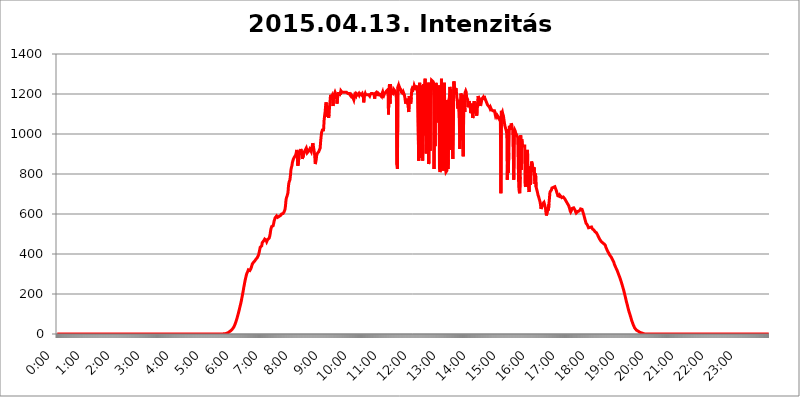
| Category | 2015.04.13. Intenzitás [W/m^2] |
|---|---|
| 0.0 | -0.256 |
| 0.0006944444444444445 | -0.256 |
| 0.001388888888888889 | -0.256 |
| 0.0020833333333333333 | -0.256 |
| 0.002777777777777778 | -0.256 |
| 0.003472222222222222 | -0.256 |
| 0.004166666666666667 | -0.256 |
| 0.004861111111111111 | -0.256 |
| 0.005555555555555556 | -0.256 |
| 0.0062499999999999995 | -0.256 |
| 0.006944444444444444 | -0.256 |
| 0.007638888888888889 | -0.256 |
| 0.008333333333333333 | -0.256 |
| 0.009027777777777779 | -0.256 |
| 0.009722222222222222 | -0.256 |
| 0.010416666666666666 | -0.256 |
| 0.011111111111111112 | -0.256 |
| 0.011805555555555555 | -0.256 |
| 0.012499999999999999 | -0.256 |
| 0.013194444444444444 | -0.256 |
| 0.013888888888888888 | -0.256 |
| 0.014583333333333332 | -0.256 |
| 0.015277777777777777 | -0.256 |
| 0.015972222222222224 | -0.256 |
| 0.016666666666666666 | -0.256 |
| 0.017361111111111112 | -0.256 |
| 0.018055555555555557 | -0.256 |
| 0.01875 | -0.256 |
| 0.019444444444444445 | -0.256 |
| 0.02013888888888889 | -0.256 |
| 0.020833333333333332 | -0.256 |
| 0.02152777777777778 | -0.256 |
| 0.022222222222222223 | -0.256 |
| 0.02291666666666667 | -0.256 |
| 0.02361111111111111 | -0.256 |
| 0.024305555555555556 | -0.256 |
| 0.024999999999999998 | -0.256 |
| 0.025694444444444447 | -0.256 |
| 0.02638888888888889 | -0.256 |
| 0.027083333333333334 | -0.256 |
| 0.027777777777777776 | -0.256 |
| 0.02847222222222222 | -0.256 |
| 0.029166666666666664 | -0.256 |
| 0.029861111111111113 | -0.256 |
| 0.030555555555555555 | -0.256 |
| 0.03125 | -0.256 |
| 0.03194444444444445 | -0.256 |
| 0.03263888888888889 | -0.256 |
| 0.03333333333333333 | -0.256 |
| 0.034027777777777775 | -0.256 |
| 0.034722222222222224 | -0.256 |
| 0.035416666666666666 | -0.256 |
| 0.036111111111111115 | -0.256 |
| 0.03680555555555556 | -0.256 |
| 0.0375 | -0.256 |
| 0.03819444444444444 | -0.256 |
| 0.03888888888888889 | -0.256 |
| 0.03958333333333333 | -0.256 |
| 0.04027777777777778 | -0.256 |
| 0.04097222222222222 | -0.256 |
| 0.041666666666666664 | -0.256 |
| 0.042361111111111106 | -0.256 |
| 0.04305555555555556 | -0.256 |
| 0.043750000000000004 | -0.256 |
| 0.044444444444444446 | -0.256 |
| 0.04513888888888889 | -0.256 |
| 0.04583333333333334 | -0.256 |
| 0.04652777777777778 | -0.256 |
| 0.04722222222222222 | -0.256 |
| 0.04791666666666666 | -0.256 |
| 0.04861111111111111 | -0.256 |
| 0.049305555555555554 | -0.256 |
| 0.049999999999999996 | -0.256 |
| 0.05069444444444445 | -0.256 |
| 0.051388888888888894 | -0.256 |
| 0.052083333333333336 | -0.256 |
| 0.05277777777777778 | -0.256 |
| 0.05347222222222222 | -0.256 |
| 0.05416666666666667 | -0.256 |
| 0.05486111111111111 | -0.256 |
| 0.05555555555555555 | -0.256 |
| 0.05625 | -0.256 |
| 0.05694444444444444 | -0.256 |
| 0.057638888888888885 | -0.256 |
| 0.05833333333333333 | -0.256 |
| 0.05902777777777778 | -0.256 |
| 0.059722222222222225 | -0.256 |
| 0.06041666666666667 | -0.256 |
| 0.061111111111111116 | -0.256 |
| 0.06180555555555556 | -0.256 |
| 0.0625 | -0.256 |
| 0.06319444444444444 | -0.256 |
| 0.06388888888888888 | -0.256 |
| 0.06458333333333334 | -0.256 |
| 0.06527777777777778 | -0.256 |
| 0.06597222222222222 | -0.256 |
| 0.06666666666666667 | -0.256 |
| 0.06736111111111111 | -0.256 |
| 0.06805555555555555 | -0.256 |
| 0.06874999999999999 | -0.256 |
| 0.06944444444444443 | -0.256 |
| 0.07013888888888889 | -0.256 |
| 0.07083333333333333 | -0.256 |
| 0.07152777777777779 | -0.256 |
| 0.07222222222222223 | -0.256 |
| 0.07291666666666667 | -0.256 |
| 0.07361111111111111 | -0.256 |
| 0.07430555555555556 | -0.256 |
| 0.075 | -0.256 |
| 0.07569444444444444 | -0.256 |
| 0.0763888888888889 | -0.256 |
| 0.07708333333333334 | -0.256 |
| 0.07777777777777778 | -0.256 |
| 0.07847222222222222 | -0.256 |
| 0.07916666666666666 | -0.256 |
| 0.0798611111111111 | -0.256 |
| 0.08055555555555556 | -0.256 |
| 0.08125 | -0.256 |
| 0.08194444444444444 | -0.256 |
| 0.08263888888888889 | -0.256 |
| 0.08333333333333333 | -0.256 |
| 0.08402777777777777 | -0.256 |
| 0.08472222222222221 | -0.256 |
| 0.08541666666666665 | -0.256 |
| 0.08611111111111112 | -0.256 |
| 0.08680555555555557 | -0.256 |
| 0.08750000000000001 | -0.256 |
| 0.08819444444444445 | -0.256 |
| 0.08888888888888889 | -0.256 |
| 0.08958333333333333 | -0.256 |
| 0.09027777777777778 | -0.256 |
| 0.09097222222222222 | -0.256 |
| 0.09166666666666667 | -0.256 |
| 0.09236111111111112 | -0.256 |
| 0.09305555555555556 | -0.256 |
| 0.09375 | -0.256 |
| 0.09444444444444444 | -0.256 |
| 0.09513888888888888 | -0.256 |
| 0.09583333333333333 | -0.256 |
| 0.09652777777777777 | -0.256 |
| 0.09722222222222222 | -0.256 |
| 0.09791666666666667 | -0.256 |
| 0.09861111111111111 | -0.256 |
| 0.09930555555555555 | -0.256 |
| 0.09999999999999999 | -0.256 |
| 0.10069444444444443 | -0.256 |
| 0.1013888888888889 | -0.256 |
| 0.10208333333333335 | -0.256 |
| 0.10277777777777779 | -0.256 |
| 0.10347222222222223 | -0.256 |
| 0.10416666666666667 | -0.256 |
| 0.10486111111111111 | -0.256 |
| 0.10555555555555556 | -0.256 |
| 0.10625 | -0.256 |
| 0.10694444444444444 | -0.256 |
| 0.1076388888888889 | -0.256 |
| 0.10833333333333334 | -0.256 |
| 0.10902777777777778 | -0.256 |
| 0.10972222222222222 | -0.256 |
| 0.1111111111111111 | -0.256 |
| 0.11180555555555556 | -0.256 |
| 0.11180555555555556 | -0.256 |
| 0.1125 | -0.256 |
| 0.11319444444444444 | -0.256 |
| 0.11388888888888889 | -0.256 |
| 0.11458333333333333 | -0.256 |
| 0.11527777777777777 | -0.256 |
| 0.11597222222222221 | -0.256 |
| 0.11666666666666665 | -0.256 |
| 0.1173611111111111 | -0.256 |
| 0.11805555555555557 | -0.256 |
| 0.11944444444444445 | -0.256 |
| 0.12013888888888889 | -0.256 |
| 0.12083333333333333 | -0.256 |
| 0.12152777777777778 | -0.256 |
| 0.12222222222222223 | -0.256 |
| 0.12291666666666667 | -0.256 |
| 0.12291666666666667 | -0.256 |
| 0.12361111111111112 | -0.256 |
| 0.12430555555555556 | -0.256 |
| 0.125 | -0.256 |
| 0.12569444444444444 | -0.256 |
| 0.12638888888888888 | -0.256 |
| 0.12708333333333333 | -0.256 |
| 0.16875 | -0.256 |
| 0.12847222222222224 | -0.256 |
| 0.12916666666666668 | -0.256 |
| 0.12986111111111112 | -0.256 |
| 0.13055555555555556 | -0.256 |
| 0.13125 | -0.256 |
| 0.13194444444444445 | -0.256 |
| 0.1326388888888889 | -0.256 |
| 0.13333333333333333 | -0.256 |
| 0.13402777777777777 | -0.256 |
| 0.13402777777777777 | -0.256 |
| 0.13472222222222222 | -0.256 |
| 0.13541666666666666 | -0.256 |
| 0.1361111111111111 | -0.256 |
| 0.13749999999999998 | -0.256 |
| 0.13819444444444443 | -0.256 |
| 0.1388888888888889 | -0.256 |
| 0.13958333333333334 | -0.256 |
| 0.14027777777777778 | -0.256 |
| 0.14097222222222222 | -0.256 |
| 0.14166666666666666 | -0.256 |
| 0.1423611111111111 | -0.256 |
| 0.14305555555555557 | -0.256 |
| 0.14375000000000002 | -0.256 |
| 0.14444444444444446 | -0.256 |
| 0.1451388888888889 | -0.256 |
| 0.1451388888888889 | -0.256 |
| 0.14652777777777778 | -0.256 |
| 0.14722222222222223 | -0.256 |
| 0.14791666666666667 | -0.256 |
| 0.1486111111111111 | -0.256 |
| 0.14930555555555555 | -0.256 |
| 0.15 | -0.256 |
| 0.15069444444444444 | -0.256 |
| 0.15138888888888888 | -0.256 |
| 0.15208333333333332 | -0.256 |
| 0.15277777777777776 | -0.256 |
| 0.15347222222222223 | -0.256 |
| 0.15416666666666667 | -0.256 |
| 0.15486111111111112 | -0.256 |
| 0.15555555555555556 | -0.256 |
| 0.15625 | -0.256 |
| 0.15694444444444444 | -0.256 |
| 0.15763888888888888 | -0.256 |
| 0.15833333333333333 | -0.256 |
| 0.15902777777777777 | -0.256 |
| 0.15972222222222224 | -0.256 |
| 0.16041666666666668 | -0.256 |
| 0.16111111111111112 | -0.256 |
| 0.16180555555555556 | -0.256 |
| 0.1625 | -0.256 |
| 0.16319444444444445 | -0.256 |
| 0.1638888888888889 | -0.256 |
| 0.16458333333333333 | -0.256 |
| 0.16527777777777777 | -0.256 |
| 0.16597222222222222 | -0.256 |
| 0.16666666666666666 | -0.256 |
| 0.1673611111111111 | -0.256 |
| 0.16805555555555554 | -0.256 |
| 0.16874999999999998 | -0.256 |
| 0.16944444444444443 | -0.256 |
| 0.17013888888888887 | -0.256 |
| 0.1708333333333333 | -0.256 |
| 0.17152777777777775 | -0.256 |
| 0.17222222222222225 | -0.256 |
| 0.1729166666666667 | -0.256 |
| 0.17361111111111113 | -0.256 |
| 0.17430555555555557 | -0.256 |
| 0.17500000000000002 | -0.256 |
| 0.17569444444444446 | -0.256 |
| 0.1763888888888889 | -0.256 |
| 0.17708333333333334 | -0.256 |
| 0.17777777777777778 | -0.256 |
| 0.17847222222222223 | -0.256 |
| 0.17916666666666667 | -0.256 |
| 0.1798611111111111 | -0.256 |
| 0.18055555555555555 | -0.256 |
| 0.18125 | -0.256 |
| 0.18194444444444444 | -0.256 |
| 0.1826388888888889 | -0.256 |
| 0.18333333333333335 | -0.256 |
| 0.1840277777777778 | -0.256 |
| 0.18472222222222223 | -0.256 |
| 0.18541666666666667 | -0.256 |
| 0.18611111111111112 | -0.256 |
| 0.18680555555555556 | -0.256 |
| 0.1875 | -0.256 |
| 0.18819444444444444 | -0.256 |
| 0.18888888888888888 | -0.256 |
| 0.18958333333333333 | -0.256 |
| 0.19027777777777777 | -0.256 |
| 0.1909722222222222 | -0.256 |
| 0.19166666666666665 | -0.256 |
| 0.19236111111111112 | -0.256 |
| 0.19305555555555554 | -0.256 |
| 0.19375 | -0.256 |
| 0.19444444444444445 | -0.256 |
| 0.1951388888888889 | -0.256 |
| 0.19583333333333333 | -0.256 |
| 0.19652777777777777 | -0.256 |
| 0.19722222222222222 | -0.256 |
| 0.19791666666666666 | -0.256 |
| 0.1986111111111111 | -0.256 |
| 0.19930555555555554 | -0.256 |
| 0.19999999999999998 | -0.256 |
| 0.20069444444444443 | -0.256 |
| 0.20138888888888887 | -0.256 |
| 0.2020833333333333 | -0.256 |
| 0.2027777777777778 | -0.256 |
| 0.2034722222222222 | -0.256 |
| 0.2041666666666667 | -0.256 |
| 0.20486111111111113 | -0.256 |
| 0.20555555555555557 | -0.256 |
| 0.20625000000000002 | -0.256 |
| 0.20694444444444446 | -0.256 |
| 0.2076388888888889 | -0.256 |
| 0.20833333333333334 | -0.256 |
| 0.20902777777777778 | -0.256 |
| 0.20972222222222223 | -0.256 |
| 0.21041666666666667 | -0.256 |
| 0.2111111111111111 | -0.256 |
| 0.21180555555555555 | -0.256 |
| 0.2125 | -0.256 |
| 0.21319444444444444 | -0.256 |
| 0.2138888888888889 | -0.256 |
| 0.21458333333333335 | -0.256 |
| 0.2152777777777778 | -0.256 |
| 0.21597222222222223 | -0.256 |
| 0.21666666666666667 | -0.256 |
| 0.21736111111111112 | -0.256 |
| 0.21805555555555556 | -0.256 |
| 0.21875 | -0.256 |
| 0.21944444444444444 | -0.256 |
| 0.22013888888888888 | -0.256 |
| 0.22083333333333333 | -0.256 |
| 0.22152777777777777 | -0.256 |
| 0.2222222222222222 | -0.256 |
| 0.22291666666666665 | -0.256 |
| 0.2236111111111111 | -0.256 |
| 0.22430555555555556 | -0.256 |
| 0.225 | -0.256 |
| 0.22569444444444445 | -0.256 |
| 0.2263888888888889 | -0.256 |
| 0.22708333333333333 | -0.256 |
| 0.22777777777777777 | -0.256 |
| 0.22847222222222222 | -0.256 |
| 0.22916666666666666 | -0.256 |
| 0.2298611111111111 | -0.256 |
| 0.23055555555555554 | -0.256 |
| 0.23124999999999998 | -0.256 |
| 0.23194444444444443 | -0.256 |
| 0.23263888888888887 | -0.256 |
| 0.2333333333333333 | 1.09 |
| 0.2340277777777778 | 1.09 |
| 0.2347222222222222 | 1.09 |
| 0.2354166666666667 | 1.09 |
| 0.23611111111111113 | 2.439 |
| 0.23680555555555557 | 3.791 |
| 0.23750000000000002 | 3.791 |
| 0.23819444444444446 | 5.146 |
| 0.2388888888888889 | 6.503 |
| 0.23958333333333334 | 6.503 |
| 0.24027777777777778 | 9.225 |
| 0.24097222222222223 | 9.225 |
| 0.24166666666666667 | 11.956 |
| 0.2423611111111111 | 13.325 |
| 0.24305555555555555 | 14.696 |
| 0.24375 | 17.444 |
| 0.24444444444444446 | 20.201 |
| 0.24513888888888888 | 22.965 |
| 0.24583333333333335 | 25.736 |
| 0.2465277777777778 | 28.514 |
| 0.24722222222222223 | 32.691 |
| 0.24791666666666667 | 36.881 |
| 0.24861111111111112 | 42.483 |
| 0.24930555555555556 | 48.1 |
| 0.25 | 55.139 |
| 0.25069444444444444 | 62.189 |
| 0.2513888888888889 | 70.658 |
| 0.2520833333333333 | 77.715 |
| 0.25277777777777777 | 87.583 |
| 0.2534722222222222 | 96.022 |
| 0.25416666666666665 | 105.834 |
| 0.2548611111111111 | 115.598 |
| 0.2555555555555556 | 125.304 |
| 0.25625000000000003 | 136.314 |
| 0.2569444444444445 | 145.865 |
| 0.2576388888888889 | 156.678 |
| 0.25833333333333336 | 168.703 |
| 0.2590277777777778 | 181.877 |
| 0.25972222222222224 | 194.849 |
| 0.2604166666666667 | 207.615 |
| 0.2611111111111111 | 221.422 |
| 0.26180555555555557 | 236.212 |
| 0.2625 | 249.538 |
| 0.26319444444444445 | 262.666 |
| 0.2638888888888889 | 274.454 |
| 0.26458333333333334 | 284.967 |
| 0.2652777777777778 | 295.413 |
| 0.2659722222222222 | 303.509 |
| 0.26666666666666666 | 308.129 |
| 0.2673611111111111 | 313.904 |
| 0.26805555555555555 | 320.84 |
| 0.26875 | 320.84 |
| 0.26944444444444443 | 316.215 |
| 0.2701388888888889 | 317.371 |
| 0.2708333333333333 | 321.998 |
| 0.27152777777777776 | 326.633 |
| 0.2722222222222222 | 333.608 |
| 0.27291666666666664 | 341.794 |
| 0.2736111111111111 | 350.049 |
| 0.2743055555555555 | 354.805 |
| 0.27499999999999997 | 357.196 |
| 0.27569444444444446 | 358.394 |
| 0.27638888888888885 | 362.004 |
| 0.27708333333333335 | 365.635 |
| 0.2777777777777778 | 369.291 |
| 0.27847222222222223 | 372.972 |
| 0.2791666666666667 | 374.206 |
| 0.2798611111111111 | 376.682 |
| 0.28055555555555556 | 381.674 |
| 0.28125 | 386.723 |
| 0.28194444444444444 | 391.834 |
| 0.2826388888888889 | 399.628 |
| 0.2833333333333333 | 410.283 |
| 0.28402777777777777 | 422.678 |
| 0.2847222222222222 | 434.107 |
| 0.28541666666666665 | 434.107 |
| 0.28611111111111115 | 431.211 |
| 0.28680555555555554 | 441.469 |
| 0.28750000000000003 | 456.747 |
| 0.2881944444444445 | 456.747 |
| 0.2888888888888889 | 461.486 |
| 0.28958333333333336 | 466.302 |
| 0.2902777777777778 | 471.198 |
| 0.29097222222222224 | 474.507 |
| 0.2916666666666667 | 476.176 |
| 0.2923611111111111 | 476.176 |
| 0.29305555555555557 | 467.925 |
| 0.29375 | 461.486 |
| 0.29444444444444445 | 463.083 |
| 0.2951388888888889 | 472.848 |
| 0.29583333333333334 | 471.198 |
| 0.2965277777777778 | 474.507 |
| 0.2972222222222222 | 479.541 |
| 0.29791666666666666 | 488.126 |
| 0.2986111111111111 | 500.575 |
| 0.29930555555555555 | 517.375 |
| 0.3 | 529.108 |
| 0.30069444444444443 | 537.182 |
| 0.3013888888888889 | 539.234 |
| 0.3020833333333333 | 537.182 |
| 0.30277777777777776 | 541.298 |
| 0.3034722222222222 | 551.823 |
| 0.30416666666666664 | 564.917 |
| 0.3048611111111111 | 571.661 |
| 0.3055555555555555 | 580.866 |
| 0.30624999999999997 | 585.562 |
| 0.3069444444444444 | 585.562 |
| 0.3076388888888889 | 590.321 |
| 0.30833333333333335 | 585.562 |
| 0.3090277777777778 | 583.206 |
| 0.30972222222222223 | 583.206 |
| 0.3104166666666667 | 585.562 |
| 0.3111111111111111 | 587.934 |
| 0.31180555555555556 | 587.934 |
| 0.3125 | 587.934 |
| 0.31319444444444444 | 592.725 |
| 0.3138888888888889 | 597.582 |
| 0.3145833333333333 | 600.035 |
| 0.31527777777777777 | 597.582 |
| 0.3159722222222222 | 600.035 |
| 0.31666666666666665 | 602.505 |
| 0.31736111111111115 | 604.992 |
| 0.31805555555555554 | 610.016 |
| 0.31875000000000003 | 612.554 |
| 0.3194444444444445 | 622.881 |
| 0.3201388888888889 | 641.649 |
| 0.32083333333333336 | 670.078 |
| 0.3215277777777778 | 682.011 |
| 0.32222222222222224 | 688.102 |
| 0.3229166666666667 | 685.046 |
| 0.3236111111111111 | 706.89 |
| 0.32430555555555557 | 739.988 |
| 0.325 | 757.414 |
| 0.32569444444444445 | 764.555 |
| 0.3263888888888889 | 771.794 |
| 0.32708333333333334 | 794.119 |
| 0.3277777777777778 | 821.353 |
| 0.3284722222222222 | 833.43 |
| 0.32916666666666666 | 841.619 |
| 0.3298611111111111 | 858.335 |
| 0.33055555555555555 | 866.865 |
| 0.33125 | 875.511 |
| 0.33194444444444443 | 871.173 |
| 0.3326388888888889 | 879.878 |
| 0.3333333333333333 | 888.701 |
| 0.3340277777777778 | 888.701 |
| 0.3347222222222222 | 897.643 |
| 0.3354166666666667 | 911.285 |
| 0.3361111111111111 | 920.533 |
| 0.3368055555555556 | 915.893 |
| 0.33749999999999997 | 841.619 |
| 0.33819444444444446 | 845.755 |
| 0.33888888888888885 | 879.878 |
| 0.33958333333333335 | 915.893 |
| 0.34027777777777773 | 897.643 |
| 0.34097222222222223 | 906.707 |
| 0.3416666666666666 | 925.203 |
| 0.3423611111111111 | 911.285 |
| 0.3430555555555555 | 911.285 |
| 0.34375 | 875.511 |
| 0.3444444444444445 | 875.511 |
| 0.3451388888888889 | 893.157 |
| 0.3458333333333334 | 915.893 |
| 0.34652777777777777 | 906.707 |
| 0.34722222222222227 | 906.707 |
| 0.34791666666666665 | 920.533 |
| 0.34861111111111115 | 915.893 |
| 0.34930555555555554 | 929.905 |
| 0.35000000000000003 | 920.533 |
| 0.3506944444444444 | 906.707 |
| 0.3513888888888889 | 911.285 |
| 0.3520833333333333 | 906.707 |
| 0.3527777777777778 | 915.893 |
| 0.3534722222222222 | 915.893 |
| 0.3541666666666667 | 925.203 |
| 0.3548611111111111 | 920.533 |
| 0.35555555555555557 | 925.203 |
| 0.35625 | 911.285 |
| 0.35694444444444445 | 915.893 |
| 0.3576388888888889 | 939.404 |
| 0.35833333333333334 | 953.892 |
| 0.3590277777777778 | 944.201 |
| 0.3597222222222222 | 939.404 |
| 0.36041666666666666 | 911.285 |
| 0.3611111111111111 | 893.157 |
| 0.36180555555555555 | 849.92 |
| 0.3625 | 858.335 |
| 0.36319444444444443 | 871.173 |
| 0.3638888888888889 | 893.157 |
| 0.3645833333333333 | 902.16 |
| 0.3652777777777778 | 906.707 |
| 0.3659722222222222 | 902.16 |
| 0.3666666666666667 | 911.285 |
| 0.3673611111111111 | 911.285 |
| 0.3680555555555556 | 915.893 |
| 0.36874999999999997 | 929.905 |
| 0.36944444444444446 | 963.712 |
| 0.37013888888888885 | 988.839 |
| 0.37083333333333335 | 1009.546 |
| 0.37152777777777773 | 1014.809 |
| 0.37222222222222223 | 1025.437 |
| 0.3729166666666666 | 1014.809 |
| 0.3736111111111111 | 1025.437 |
| 0.3743055555555555 | 1069.368 |
| 0.375 | 1092.203 |
| 0.3756944444444445 | 1109.72 |
| 0.3763888888888889 | 1139.675 |
| 0.3770833333333334 | 1158.113 |
| 0.37777777777777777 | 1133.607 |
| 0.37847222222222227 | 1127.578 |
| 0.37916666666666665 | 1086.439 |
| 0.37986111111111115 | 1115.634 |
| 0.38055555555555554 | 1080.711 |
| 0.38125000000000003 | 1098.004 |
| 0.3819444444444444 | 1139.675 |
| 0.3826388888888889 | 1164.337 |
| 0.3833333333333333 | 1196.058 |
| 0.3840277777777778 | 1176.905 |
| 0.3847222222222222 | 1183.249 |
| 0.3854166666666667 | 1189.633 |
| 0.3861111111111111 | 1176.905 |
| 0.38680555555555557 | 1139.675 |
| 0.3875 | 1183.249 |
| 0.38819444444444445 | 1196.058 |
| 0.3888888888888889 | 1196.058 |
| 0.38958333333333334 | 1209.029 |
| 0.3902777777777778 | 1202.523 |
| 0.3909722222222222 | 1196.058 |
| 0.39166666666666666 | 1183.249 |
| 0.3923611111111111 | 1151.928 |
| 0.39305555555555555 | 1176.905 |
| 0.39375 | 1196.058 |
| 0.39444444444444443 | 1209.029 |
| 0.3951388888888889 | 1209.029 |
| 0.3958333333333333 | 1189.633 |
| 0.3965277777777778 | 1209.029 |
| 0.3972222222222222 | 1196.058 |
| 0.3979166666666667 | 1215.576 |
| 0.3986111111111111 | 1215.576 |
| 0.3993055555555556 | 1209.029 |
| 0.39999999999999997 | 1209.029 |
| 0.40069444444444446 | 1209.029 |
| 0.40138888888888885 | 1209.029 |
| 0.40208333333333335 | 1209.029 |
| 0.40277777777777773 | 1209.029 |
| 0.40347222222222223 | 1209.029 |
| 0.4041666666666666 | 1209.029 |
| 0.4048611111111111 | 1209.029 |
| 0.4055555555555555 | 1209.029 |
| 0.40625 | 1209.029 |
| 0.4069444444444445 | 1209.029 |
| 0.4076388888888889 | 1202.523 |
| 0.4083333333333334 | 1202.523 |
| 0.40902777777777777 | 1202.523 |
| 0.40972222222222227 | 1202.523 |
| 0.41041666666666665 | 1196.058 |
| 0.41111111111111115 | 1196.058 |
| 0.41180555555555554 | 1189.633 |
| 0.41250000000000003 | 1196.058 |
| 0.4131944444444444 | 1196.058 |
| 0.4138888888888889 | 1189.633 |
| 0.4145833333333333 | 1183.249 |
| 0.4152777777777778 | 1176.905 |
| 0.4159722222222222 | 1170.601 |
| 0.4166666666666667 | 1183.249 |
| 0.4173611111111111 | 1196.058 |
| 0.41805555555555557 | 1196.058 |
| 0.41875 | 1189.633 |
| 0.41944444444444445 | 1202.523 |
| 0.4201388888888889 | 1202.523 |
| 0.42083333333333334 | 1202.523 |
| 0.4215277777777778 | 1196.058 |
| 0.4222222222222222 | 1196.058 |
| 0.42291666666666666 | 1202.523 |
| 0.4236111111111111 | 1196.058 |
| 0.42430555555555555 | 1202.523 |
| 0.425 | 1202.523 |
| 0.42569444444444443 | 1202.523 |
| 0.4263888888888889 | 1196.058 |
| 0.4270833333333333 | 1196.058 |
| 0.4277777777777778 | 1202.523 |
| 0.4284722222222222 | 1196.058 |
| 0.4291666666666667 | 1189.633 |
| 0.4298611111111111 | 1158.113 |
| 0.4305555555555556 | 1189.633 |
| 0.43124999999999997 | 1196.058 |
| 0.43194444444444446 | 1202.523 |
| 0.43263888888888885 | 1196.058 |
| 0.43333333333333335 | 1196.058 |
| 0.43402777777777773 | 1196.058 |
| 0.43472222222222223 | 1196.058 |
| 0.4354166666666666 | 1196.058 |
| 0.4361111111111111 | 1196.058 |
| 0.4368055555555555 | 1196.058 |
| 0.4375 | 1196.058 |
| 0.4381944444444445 | 1189.633 |
| 0.4388888888888889 | 1196.058 |
| 0.4395833333333334 | 1196.058 |
| 0.44027777777777777 | 1202.523 |
| 0.44097222222222227 | 1202.523 |
| 0.44166666666666665 | 1202.523 |
| 0.44236111111111115 | 1202.523 |
| 0.44305555555555554 | 1202.523 |
| 0.44375000000000003 | 1202.523 |
| 0.4444444444444444 | 1196.058 |
| 0.4451388888888889 | 1176.905 |
| 0.4458333333333333 | 1202.523 |
| 0.4465277777777778 | 1202.523 |
| 0.4472222222222222 | 1202.523 |
| 0.4479166666666667 | 1209.029 |
| 0.4486111111111111 | 1209.029 |
| 0.44930555555555557 | 1202.523 |
| 0.45 | 1189.633 |
| 0.45069444444444445 | 1202.523 |
| 0.4513888888888889 | 1202.523 |
| 0.45208333333333334 | 1202.523 |
| 0.4527777777777778 | 1196.058 |
| 0.4534722222222222 | 1196.058 |
| 0.45416666666666666 | 1189.633 |
| 0.4548611111111111 | 1196.058 |
| 0.45555555555555555 | 1202.523 |
| 0.45625 | 1209.029 |
| 0.45694444444444443 | 1196.058 |
| 0.4576388888888889 | 1202.523 |
| 0.4583333333333333 | 1196.058 |
| 0.4590277777777778 | 1202.523 |
| 0.4597222222222222 | 1202.523 |
| 0.4604166666666667 | 1202.523 |
| 0.4611111111111111 | 1209.029 |
| 0.4618055555555556 | 1215.576 |
| 0.46249999999999997 | 1215.576 |
| 0.46319444444444446 | 1215.576 |
| 0.46388888888888885 | 1222.164 |
| 0.46458333333333335 | 1098.004 |
| 0.46527777777777773 | 1222.164 |
| 0.46597222222222223 | 1248.934 |
| 0.4666666666666666 | 1151.928 |
| 0.4673611111111111 | 1248.934 |
| 0.4680555555555555 | 1222.164 |
| 0.46875 | 1209.029 |
| 0.4694444444444445 | 1209.029 |
| 0.4701388888888889 | 1209.029 |
| 0.4708333333333334 | 1202.523 |
| 0.47152777777777777 | 1209.029 |
| 0.47222222222222227 | 1222.164 |
| 0.47291666666666665 | 1222.164 |
| 0.47361111111111115 | 1215.576 |
| 0.47430555555555554 | 1209.029 |
| 0.47500000000000003 | 1196.058 |
| 0.4756944444444444 | 1202.523 |
| 0.4763888888888889 | 845.755 |
| 0.4770833333333333 | 825.351 |
| 0.4777777777777778 | 1235.465 |
| 0.4784722222222222 | 1242.179 |
| 0.4791666666666667 | 1228.794 |
| 0.4798611111111111 | 1235.465 |
| 0.48055555555555557 | 1228.794 |
| 0.48125 | 1228.794 |
| 0.48194444444444445 | 1222.164 |
| 0.4826388888888889 | 1209.029 |
| 0.48333333333333334 | 1209.029 |
| 0.4840277777777778 | 1209.029 |
| 0.4847222222222222 | 1202.523 |
| 0.48541666666666666 | 1209.029 |
| 0.4861111111111111 | 1202.523 |
| 0.48680555555555555 | 1196.058 |
| 0.4875 | 1183.249 |
| 0.48819444444444443 | 1164.337 |
| 0.4888888888888889 | 1151.928 |
| 0.4895833333333333 | 1170.601 |
| 0.4902777777777778 | 1164.337 |
| 0.4909722222222222 | 1170.601 |
| 0.4916666666666667 | 1176.905 |
| 0.4923611111111111 | 1133.607 |
| 0.4930555555555556 | 1109.72 |
| 0.49374999999999997 | 1189.633 |
| 0.49444444444444446 | 1176.905 |
| 0.49513888888888885 | 1164.337 |
| 0.49583333333333335 | 1151.928 |
| 0.49652777777777773 | 1183.249 |
| 0.49722222222222223 | 1222.164 |
| 0.4979166666666666 | 1228.794 |
| 0.4986111111111111 | 1228.794 |
| 0.4993055555555555 | 1222.164 |
| 0.5 | 1228.794 |
| 0.5006944444444444 | 1242.179 |
| 0.5013888888888889 | 1235.465 |
| 0.5020833333333333 | 1235.465 |
| 0.5027777777777778 | 1222.164 |
| 0.5034722222222222 | 1242.179 |
| 0.5041666666666667 | 1222.164 |
| 0.5048611111111111 | 1215.576 |
| 0.5055555555555555 | 1222.164 |
| 0.50625 | 1222.164 |
| 0.5069444444444444 | 866.865 |
| 0.5076388888888889 | 988.839 |
| 0.5083333333333333 | 1255.731 |
| 0.5090277777777777 | 879.878 |
| 0.5097222222222222 | 963.712 |
| 0.5104166666666666 | 1242.179 |
| 0.5111111111111112 | 1228.794 |
| 0.5118055555555555 | 1189.633 |
| 0.5125000000000001 | 866.865 |
| 0.5131944444444444 | 866.865 |
| 0.513888888888889 | 1248.934 |
| 0.5145833333333333 | 993.965 |
| 0.5152777777777778 | 1248.934 |
| 0.5159722222222222 | 1276.38 |
| 0.5166666666666667 | 1196.058 |
| 0.517361111111111 | 902.16 |
| 0.5180555555555556 | 988.839 |
| 0.5187499999999999 | 1222.164 |
| 0.5194444444444445 | 1248.934 |
| 0.5201388888888888 | 1255.731 |
| 0.5208333333333334 | 849.92 |
| 0.5215277777777778 | 862.585 |
| 0.5222222222222223 | 1255.731 |
| 0.5229166666666667 | 915.893 |
| 0.5236111111111111 | 1222.164 |
| 0.5243055555555556 | 1235.465 |
| 0.525 | 1269.454 |
| 0.5256944444444445 | 1269.454 |
| 0.5263888888888889 | 1269.454 |
| 0.5270833333333333 | 1262.571 |
| 0.5277777777777778 | 1255.731 |
| 0.5284722222222222 | 825.351 |
| 0.5291666666666667 | 1222.164 |
| 0.5298611111111111 | 939.404 |
| 0.5305555555555556 | 1222.164 |
| 0.53125 | 1255.731 |
| 0.5319444444444444 | 1235.465 |
| 0.5326388888888889 | 1196.058 |
| 0.5333333333333333 | 1235.465 |
| 0.5340277777777778 | 1058.17 |
| 0.5347222222222222 | 1242.179 |
| 0.5354166666666667 | 1196.058 |
| 0.5361111111111111 | 825.351 |
| 0.5368055555555555 | 809.522 |
| 0.5375 | 821.353 |
| 0.5381944444444444 | 1080.711 |
| 0.5388888888888889 | 1276.38 |
| 0.5395833333333333 | 1183.249 |
| 0.5402777777777777 | 1242.179 |
| 0.5409722222222222 | 817.382 |
| 0.5416666666666666 | 837.51 |
| 0.5423611111111112 | 1030.804 |
| 0.5430555555555555 | 1255.731 |
| 0.5437500000000001 | 879.878 |
| 0.5444444444444444 | 825.351 |
| 0.545138888888889 | 809.522 |
| 0.5458333333333333 | 805.632 |
| 0.5465277777777778 | 817.382 |
| 0.5472222222222222 | 1170.601 |
| 0.5479166666666667 | 825.351 |
| 0.548611111111111 | 871.173 |
| 0.5493055555555556 | 1170.601 |
| 0.5499999999999999 | 1183.249 |
| 0.5506944444444445 | 1235.465 |
| 0.5513888888888888 | 1209.029 |
| 0.5520833333333334 | 1222.164 |
| 0.5527777777777778 | 920.533 |
| 0.5534722222222223 | 1052.625 |
| 0.5541666666666667 | 939.404 |
| 0.5548611111111111 | 875.511 |
| 0.5555555555555556 | 875.511 |
| 0.55625 | 1262.571 |
| 0.5569444444444445 | 1242.179 |
| 0.5576388888888889 | 1228.794 |
| 0.5583333333333333 | 1215.576 |
| 0.5590277777777778 | 1228.794 |
| 0.5597222222222222 | 1215.576 |
| 0.5604166666666667 | 1183.249 |
| 0.5611111111111111 | 1170.601 |
| 0.5618055555555556 | 1127.578 |
| 0.5625 | 1164.337 |
| 0.5631944444444444 | 1170.601 |
| 0.5638888888888889 | 1080.711 |
| 0.5645833333333333 | 925.203 |
| 0.5652777777777778 | 1115.634 |
| 0.5659722222222222 | 1202.523 |
| 0.5666666666666667 | 1202.523 |
| 0.5673611111111111 | 1189.633 |
| 0.5680555555555555 | 968.671 |
| 0.56875 | 1151.928 |
| 0.5694444444444444 | 888.701 |
| 0.5701388888888889 | 1176.905 |
| 0.5708333333333333 | 1196.058 |
| 0.5715277777777777 | 1109.72 |
| 0.5722222222222222 | 1209.029 |
| 0.5729166666666666 | 1215.576 |
| 0.5736111111111112 | 1209.029 |
| 0.5743055555555555 | 1170.601 |
| 0.5750000000000001 | 1176.905 |
| 0.5756944444444444 | 1170.601 |
| 0.576388888888889 | 1133.607 |
| 0.5770833333333333 | 1133.607 |
| 0.5777777777777778 | 1164.337 |
| 0.5784722222222222 | 1164.337 |
| 0.5791666666666667 | 1139.675 |
| 0.579861111111111 | 1103.843 |
| 0.5805555555555556 | 1115.634 |
| 0.5812499999999999 | 1127.578 |
| 0.5819444444444445 | 1151.928 |
| 0.5826388888888888 | 1080.711 |
| 0.5833333333333334 | 1086.439 |
| 0.5840277777777778 | 1139.675 |
| 0.5847222222222223 | 1164.337 |
| 0.5854166666666667 | 1127.578 |
| 0.5861111111111111 | 1103.843 |
| 0.5868055555555556 | 1127.578 |
| 0.5875 | 1127.578 |
| 0.5881944444444445 | 1092.203 |
| 0.5888888888888889 | 1103.843 |
| 0.5895833333333333 | 1158.113 |
| 0.5902777777777778 | 1189.633 |
| 0.5909722222222222 | 1189.633 |
| 0.5916666666666667 | 1176.905 |
| 0.5923611111111111 | 1176.905 |
| 0.5930555555555556 | 1139.675 |
| 0.59375 | 1176.905 |
| 0.5944444444444444 | 1176.905 |
| 0.5951388888888889 | 1164.337 |
| 0.5958333333333333 | 1176.905 |
| 0.5965277777777778 | 1176.905 |
| 0.5972222222222222 | 1183.249 |
| 0.5979166666666667 | 1170.601 |
| 0.5986111111111111 | 1189.633 |
| 0.5993055555555555 | 1183.249 |
| 0.6 | 1176.905 |
| 0.6006944444444444 | 1170.601 |
| 0.6013888888888889 | 1164.337 |
| 0.6020833333333333 | 1164.337 |
| 0.6027777777777777 | 1151.928 |
| 0.6034722222222222 | 1145.782 |
| 0.6041666666666666 | 1145.782 |
| 0.6048611111111112 | 1139.675 |
| 0.6055555555555555 | 1139.675 |
| 0.6062500000000001 | 1133.607 |
| 0.6069444444444444 | 1127.578 |
| 0.607638888888889 | 1133.607 |
| 0.6083333333333333 | 1127.578 |
| 0.6090277777777778 | 1121.587 |
| 0.6097222222222222 | 1121.587 |
| 0.6104166666666667 | 1121.587 |
| 0.611111111111111 | 1115.634 |
| 0.6118055555555556 | 1115.634 |
| 0.6124999999999999 | 1115.634 |
| 0.6131944444444445 | 1115.634 |
| 0.6138888888888888 | 1103.843 |
| 0.6145833333333334 | 1092.203 |
| 0.6152777777777778 | 1098.004 |
| 0.6159722222222223 | 1098.004 |
| 0.6166666666666667 | 1086.439 |
| 0.6173611111111111 | 1092.203 |
| 0.6180555555555556 | 1092.203 |
| 0.61875 | 1092.203 |
| 0.6194444444444445 | 1080.711 |
| 0.6201388888888889 | 1075.021 |
| 0.6208333333333333 | 1086.439 |
| 0.6215277777777778 | 1063.751 |
| 0.6222222222222222 | 703.704 |
| 0.6229166666666667 | 1115.634 |
| 0.6236111111111111 | 1103.843 |
| 0.6243055555555556 | 1109.72 |
| 0.625 | 1098.004 |
| 0.6256944444444444 | 1092.203 |
| 0.6263888888888889 | 1075.021 |
| 0.6270833333333333 | 1058.17 |
| 0.6277777777777778 | 1041.644 |
| 0.6284722222222222 | 1041.644 |
| 0.6291666666666667 | 1041.644 |
| 0.6298611111111111 | 1014.809 |
| 0.6305555555555555 | 999.125 |
| 0.63125 | 771.794 |
| 0.6319444444444444 | 1025.437 |
| 0.6326388888888889 | 805.632 |
| 0.6333333333333333 | 906.707 |
| 0.6340277777777777 | 1041.644 |
| 0.6347222222222222 | 1036.206 |
| 0.6354166666666666 | 1025.437 |
| 0.6361111111111112 | 1020.106 |
| 0.6368055555555555 | 1052.625 |
| 0.6375000000000001 | 1047.117 |
| 0.6381944444444444 | 1025.437 |
| 0.638888888888889 | 1020.106 |
| 0.6395833333333333 | 902.16 |
| 0.6402777777777778 | 771.794 |
| 0.6409722222222222 | 1009.546 |
| 0.6416666666666667 | 1020.106 |
| 0.642361111111111 | 1014.809 |
| 0.6430555555555556 | 1004.318 |
| 0.6437499999999999 | 999.125 |
| 0.6444444444444445 | 993.965 |
| 0.6451388888888888 | 993.965 |
| 0.6458333333333334 | 983.747 |
| 0.6465277777777778 | 983.747 |
| 0.6472222222222223 | 739.988 |
| 0.6479166666666667 | 713.328 |
| 0.6486111111111111 | 703.704 |
| 0.6493055555555556 | 786.575 |
| 0.65 | 993.965 |
| 0.6506944444444445 | 821.353 |
| 0.6513888888888889 | 973.663 |
| 0.6520833333333333 | 953.892 |
| 0.6527777777777778 | 949.03 |
| 0.6534722222222222 | 939.404 |
| 0.6541666666666667 | 944.201 |
| 0.6548611111111111 | 944.201 |
| 0.6555555555555556 | 939.404 |
| 0.65625 | 743.425 |
| 0.6569444444444444 | 736.574 |
| 0.6576388888888889 | 906.707 |
| 0.6583333333333333 | 866.865 |
| 0.6590277777777778 | 920.533 |
| 0.6597222222222222 | 902.16 |
| 0.6604166666666667 | 750.371 |
| 0.6611111111111111 | 733.184 |
| 0.6618055555555555 | 710.098 |
| 0.6625 | 837.51 |
| 0.6631944444444444 | 775.451 |
| 0.6638888888888889 | 746.886 |
| 0.6645833333333333 | 829.377 |
| 0.6652777777777777 | 862.585 |
| 0.6659722222222222 | 862.585 |
| 0.6666666666666666 | 841.619 |
| 0.6673611111111111 | 809.522 |
| 0.6680555555555556 | 813.439 |
| 0.6687500000000001 | 833.43 |
| 0.6694444444444444 | 829.377 |
| 0.6701388888888888 | 750.371 |
| 0.6708333333333334 | 801.768 |
| 0.6715277777777778 | 736.574 |
| 0.6722222222222222 | 733.184 |
| 0.6729166666666666 | 716.58 |
| 0.6736111111111112 | 706.89 |
| 0.6743055555555556 | 694.278 |
| 0.6749999999999999 | 688.102 |
| 0.6756944444444444 | 678.997 |
| 0.6763888888888889 | 670.078 |
| 0.6770833333333334 | 661.343 |
| 0.6777777777777777 | 647.179 |
| 0.6784722222222223 | 625.508 |
| 0.6791666666666667 | 628.152 |
| 0.6798611111111111 | 638.912 |
| 0.6805555555555555 | 649.973 |
| 0.68125 | 647.179 |
| 0.6819444444444445 | 652.786 |
| 0.6826388888888889 | 658.471 |
| 0.6833333333333332 | 649.973 |
| 0.6840277777777778 | 649.973 |
| 0.6847222222222222 | 630.814 |
| 0.6854166666666667 | 607.495 |
| 0.686111111111111 | 592.725 |
| 0.6868055555555556 | 597.582 |
| 0.6875 | 617.682 |
| 0.6881944444444444 | 625.508 |
| 0.688888888888889 | 617.682 |
| 0.6895833333333333 | 649.973 |
| 0.6902777777777778 | 676.003 |
| 0.6909722222222222 | 706.89 |
| 0.6916666666666668 | 713.328 |
| 0.6923611111111111 | 713.328 |
| 0.6930555555555555 | 719.855 |
| 0.69375 | 729.817 |
| 0.6944444444444445 | 733.184 |
| 0.6951388888888889 | 729.817 |
| 0.6958333333333333 | 733.184 |
| 0.6965277777777777 | 736.574 |
| 0.6972222222222223 | 736.574 |
| 0.6979166666666666 | 736.574 |
| 0.6986111111111111 | 729.817 |
| 0.6993055555555556 | 726.474 |
| 0.7000000000000001 | 716.58 |
| 0.7006944444444444 | 706.89 |
| 0.7013888888888888 | 700.54 |
| 0.7020833333333334 | 691.18 |
| 0.7027777777777778 | 691.18 |
| 0.7034722222222222 | 688.102 |
| 0.7041666666666666 | 688.102 |
| 0.7048611111111112 | 694.278 |
| 0.7055555555555556 | 691.18 |
| 0.7062499999999999 | 688.102 |
| 0.7069444444444444 | 685.046 |
| 0.7076388888888889 | 682.011 |
| 0.7083333333333334 | 682.011 |
| 0.7090277777777777 | 685.046 |
| 0.7097222222222223 | 685.046 |
| 0.7104166666666667 | 688.102 |
| 0.7111111111111111 | 682.011 |
| 0.7118055555555555 | 676.003 |
| 0.7125 | 676.003 |
| 0.7131944444444445 | 667.146 |
| 0.7138888888888889 | 664.234 |
| 0.7145833333333332 | 658.471 |
| 0.7152777777777778 | 655.618 |
| 0.7159722222222222 | 649.973 |
| 0.7166666666666667 | 647.179 |
| 0.717361111111111 | 641.649 |
| 0.7180555555555556 | 633.495 |
| 0.71875 | 625.508 |
| 0.7194444444444444 | 615.11 |
| 0.720138888888889 | 610.016 |
| 0.7208333333333333 | 615.11 |
| 0.7215277777777778 | 622.881 |
| 0.7222222222222222 | 628.152 |
| 0.7229166666666668 | 630.814 |
| 0.7236111111111111 | 630.814 |
| 0.7243055555555555 | 630.814 |
| 0.725 | 628.152 |
| 0.7256944444444445 | 622.881 |
| 0.7263888888888889 | 617.682 |
| 0.7270833333333333 | 610.016 |
| 0.7277777777777777 | 604.992 |
| 0.7284722222222223 | 604.992 |
| 0.7291666666666666 | 602.505 |
| 0.7298611111111111 | 612.554 |
| 0.7305555555555556 | 610.016 |
| 0.7312500000000001 | 615.11 |
| 0.7319444444444444 | 615.11 |
| 0.7326388888888888 | 617.682 |
| 0.7333333333333334 | 620.273 |
| 0.7340277777777778 | 625.508 |
| 0.7347222222222222 | 625.508 |
| 0.7354166666666666 | 625.508 |
| 0.7361111111111112 | 622.881 |
| 0.7368055555555556 | 615.11 |
| 0.7374999999999999 | 607.495 |
| 0.7381944444444444 | 600.035 |
| 0.7388888888888889 | 590.321 |
| 0.7395833333333334 | 580.866 |
| 0.7402777777777777 | 571.661 |
| 0.7409722222222223 | 562.699 |
| 0.7416666666666667 | 553.97 |
| 0.7423611111111111 | 551.823 |
| 0.7430555555555555 | 547.572 |
| 0.74375 | 543.376 |
| 0.7444444444444445 | 537.182 |
| 0.7451388888888889 | 531.108 |
| 0.7458333333333332 | 533.12 |
| 0.7465277777777778 | 533.12 |
| 0.7472222222222222 | 533.12 |
| 0.7479166666666667 | 535.145 |
| 0.748611111111111 | 537.182 |
| 0.7493055555555556 | 535.145 |
| 0.75 | 531.108 |
| 0.7506944444444444 | 525.148 |
| 0.751388888888889 | 523.186 |
| 0.7520833333333333 | 523.186 |
| 0.7527777777777778 | 519.3 |
| 0.7534722222222222 | 515.462 |
| 0.7541666666666668 | 511.671 |
| 0.7548611111111111 | 509.793 |
| 0.7555555555555555 | 507.927 |
| 0.75625 | 506.072 |
| 0.7569444444444445 | 502.396 |
| 0.7576388888888889 | 496.965 |
| 0.7583333333333333 | 491.63 |
| 0.7590277777777777 | 486.389 |
| 0.7597222222222223 | 481.238 |
| 0.7604166666666666 | 476.176 |
| 0.7611111111111111 | 472.848 |
| 0.7618055555555556 | 467.925 |
| 0.7625000000000001 | 464.688 |
| 0.7631944444444444 | 461.486 |
| 0.7638888888888888 | 463.083 |
| 0.7645833333333334 | 461.486 |
| 0.7652777777777778 | 455.184 |
| 0.7659722222222222 | 453.629 |
| 0.7666666666666666 | 450.542 |
| 0.7673611111111112 | 449.011 |
| 0.7680555555555556 | 449.011 |
| 0.7687499999999999 | 442.962 |
| 0.7694444444444444 | 434.107 |
| 0.7701388888888889 | 428.341 |
| 0.7708333333333334 | 422.678 |
| 0.7715277777777777 | 417.112 |
| 0.7722222222222223 | 411.638 |
| 0.7729166666666667 | 407.589 |
| 0.7736111111111111 | 403.587 |
| 0.7743055555555555 | 398.318 |
| 0.775 | 394.415 |
| 0.7756944444444445 | 390.55 |
| 0.7763888888888889 | 386.723 |
| 0.7770833333333332 | 384.191 |
| 0.7777777777777778 | 379.171 |
| 0.7784722222222222 | 374.206 |
| 0.7791666666666667 | 369.291 |
| 0.779861111111111 | 365.635 |
| 0.7805555555555556 | 359.595 |
| 0.78125 | 350.049 |
| 0.7819444444444444 | 344.144 |
| 0.782638888888889 | 338.278 |
| 0.7833333333333333 | 332.443 |
| 0.7840277777777778 | 327.793 |
| 0.7847222222222222 | 321.998 |
| 0.7854166666666668 | 316.215 |
| 0.7861111111111111 | 309.284 |
| 0.7868055555555555 | 303.509 |
| 0.7875 | 296.571 |
| 0.7881944444444445 | 289.616 |
| 0.7888888888888889 | 283.803 |
| 0.7895833333333333 | 276.797 |
| 0.7902777777777777 | 268.576 |
| 0.7909722222222223 | 261.48 |
| 0.7916666666666666 | 253.137 |
| 0.7923611111111111 | 244.717 |
| 0.7930555555555556 | 236.212 |
| 0.7937500000000001 | 227.618 |
| 0.7944444444444444 | 218.93 |
| 0.7951388888888888 | 208.881 |
| 0.7958333333333334 | 198.701 |
| 0.7965277777777778 | 188.389 |
| 0.7972222222222222 | 177.946 |
| 0.7979166666666666 | 167.374 |
| 0.7986111111111112 | 156.678 |
| 0.7993055555555556 | 148.579 |
| 0.7999999999999999 | 137.683 |
| 0.8006944444444444 | 128.065 |
| 0.8013888888888889 | 118.378 |
| 0.8020833333333334 | 110.025 |
| 0.8027777777777777 | 103.035 |
| 0.8034722222222223 | 94.617 |
| 0.8041666666666667 | 86.175 |
| 0.8048611111111111 | 77.715 |
| 0.8055555555555555 | 69.246 |
| 0.80625 | 62.189 |
| 0.8069444444444445 | 55.139 |
| 0.8076388888888889 | 48.1 |
| 0.8083333333333332 | 42.483 |
| 0.8090277777777778 | 36.881 |
| 0.8097222222222222 | 31.297 |
| 0.8104166666666667 | 27.124 |
| 0.811111111111111 | 24.35 |
| 0.8118055555555556 | 21.582 |
| 0.8125 | 18.822 |
| 0.8131944444444444 | 17.444 |
| 0.813888888888889 | 16.069 |
| 0.8145833333333333 | 14.696 |
| 0.8152777777777778 | 11.956 |
| 0.8159722222222222 | 10.589 |
| 0.8166666666666668 | 9.225 |
| 0.8173611111111111 | 7.862 |
| 0.8180555555555555 | 6.503 |
| 0.81875 | 6.503 |
| 0.8194444444444445 | 5.146 |
| 0.8201388888888889 | 3.791 |
| 0.8208333333333333 | 3.791 |
| 0.8215277777777777 | 2.439 |
| 0.8222222222222223 | 2.439 |
| 0.8229166666666666 | 1.09 |
| 0.8236111111111111 | 1.09 |
| 0.8243055555555556 | 1.09 |
| 0.8250000000000001 | -0.256 |
| 0.8256944444444444 | -0.256 |
| 0.8263888888888888 | -0.256 |
| 0.8270833333333334 | -0.256 |
| 0.8277777777777778 | -0.256 |
| 0.8284722222222222 | -0.256 |
| 0.8291666666666666 | -0.256 |
| 0.8298611111111112 | -0.256 |
| 0.8305555555555556 | -0.256 |
| 0.8312499999999999 | -0.256 |
| 0.8319444444444444 | -0.256 |
| 0.8326388888888889 | -0.256 |
| 0.8333333333333334 | -0.256 |
| 0.8340277777777777 | -0.256 |
| 0.8347222222222223 | -0.256 |
| 0.8354166666666667 | -0.256 |
| 0.8361111111111111 | -0.256 |
| 0.8368055555555555 | -0.256 |
| 0.8375 | -0.256 |
| 0.8381944444444445 | -0.256 |
| 0.8388888888888889 | -0.256 |
| 0.8395833333333332 | -0.256 |
| 0.8402777777777778 | -0.256 |
| 0.8409722222222222 | -0.256 |
| 0.8416666666666667 | -0.256 |
| 0.842361111111111 | -0.256 |
| 0.8430555555555556 | -0.256 |
| 0.84375 | -0.256 |
| 0.8444444444444444 | -0.256 |
| 0.845138888888889 | -0.256 |
| 0.8458333333333333 | -0.256 |
| 0.8465277777777778 | -0.256 |
| 0.8472222222222222 | -0.256 |
| 0.8479166666666668 | -0.256 |
| 0.8486111111111111 | -0.256 |
| 0.8493055555555555 | -0.256 |
| 0.85 | -0.256 |
| 0.8506944444444445 | -0.256 |
| 0.8513888888888889 | -0.256 |
| 0.8520833333333333 | -0.256 |
| 0.8527777777777777 | -0.256 |
| 0.8534722222222223 | -0.256 |
| 0.8541666666666666 | -0.256 |
| 0.8548611111111111 | -0.256 |
| 0.8555555555555556 | -0.256 |
| 0.8562500000000001 | -0.256 |
| 0.8569444444444444 | -0.256 |
| 0.8576388888888888 | -0.256 |
| 0.8583333333333334 | -0.256 |
| 0.8590277777777778 | -0.256 |
| 0.8597222222222222 | -0.256 |
| 0.8604166666666666 | -0.256 |
| 0.8611111111111112 | -0.256 |
| 0.8618055555555556 | -0.256 |
| 0.8624999999999999 | -0.256 |
| 0.8631944444444444 | -0.256 |
| 0.8638888888888889 | -0.256 |
| 0.8645833333333334 | -0.256 |
| 0.8652777777777777 | -0.256 |
| 0.8659722222222223 | -0.256 |
| 0.8666666666666667 | -0.256 |
| 0.8673611111111111 | -0.256 |
| 0.8680555555555555 | -0.256 |
| 0.86875 | -0.256 |
| 0.8694444444444445 | -0.256 |
| 0.8701388888888889 | -0.256 |
| 0.8708333333333332 | -0.256 |
| 0.8715277777777778 | -0.256 |
| 0.8722222222222222 | -0.256 |
| 0.8729166666666667 | -0.256 |
| 0.873611111111111 | -0.256 |
| 0.8743055555555556 | -0.256 |
| 0.875 | -0.256 |
| 0.8756944444444444 | -0.256 |
| 0.876388888888889 | -0.256 |
| 0.8770833333333333 | -0.256 |
| 0.8777777777777778 | -0.256 |
| 0.8784722222222222 | -0.256 |
| 0.8791666666666668 | -0.256 |
| 0.8798611111111111 | -0.256 |
| 0.8805555555555555 | -0.256 |
| 0.88125 | -0.256 |
| 0.8819444444444445 | -0.256 |
| 0.8826388888888889 | -0.256 |
| 0.8833333333333333 | -0.256 |
| 0.8840277777777777 | -0.256 |
| 0.8847222222222223 | -0.256 |
| 0.8854166666666666 | -0.256 |
| 0.8861111111111111 | -0.256 |
| 0.8868055555555556 | -0.256 |
| 0.8875000000000001 | -0.256 |
| 0.8881944444444444 | -0.256 |
| 0.8888888888888888 | -0.256 |
| 0.8895833333333334 | -0.256 |
| 0.8902777777777778 | -0.256 |
| 0.8909722222222222 | -0.256 |
| 0.8916666666666666 | -0.256 |
| 0.8923611111111112 | -0.256 |
| 0.8930555555555556 | -0.256 |
| 0.8937499999999999 | -0.256 |
| 0.8944444444444444 | -0.256 |
| 0.8951388888888889 | -0.256 |
| 0.8958333333333334 | -0.256 |
| 0.8965277777777777 | -0.256 |
| 0.8972222222222223 | -0.256 |
| 0.8979166666666667 | -0.256 |
| 0.8986111111111111 | -0.256 |
| 0.8993055555555555 | -0.256 |
| 0.9 | -0.256 |
| 0.9006944444444445 | -0.256 |
| 0.9013888888888889 | -0.256 |
| 0.9020833333333332 | -0.256 |
| 0.9027777777777778 | -0.256 |
| 0.9034722222222222 | -0.256 |
| 0.9041666666666667 | -0.256 |
| 0.904861111111111 | -0.256 |
| 0.9055555555555556 | -0.256 |
| 0.90625 | -0.256 |
| 0.9069444444444444 | -0.256 |
| 0.907638888888889 | -0.256 |
| 0.9083333333333333 | -0.256 |
| 0.9090277777777778 | -0.256 |
| 0.9097222222222222 | -0.256 |
| 0.9104166666666668 | -0.256 |
| 0.9111111111111111 | -0.256 |
| 0.9118055555555555 | -0.256 |
| 0.9125 | -0.256 |
| 0.9131944444444445 | -0.256 |
| 0.9138888888888889 | -0.256 |
| 0.9145833333333333 | -0.256 |
| 0.9152777777777777 | -0.256 |
| 0.9159722222222223 | -0.256 |
| 0.9166666666666666 | -0.256 |
| 0.9173611111111111 | -0.256 |
| 0.9180555555555556 | -0.256 |
| 0.9187500000000001 | -0.256 |
| 0.9194444444444444 | -0.256 |
| 0.9201388888888888 | -0.256 |
| 0.9208333333333334 | -0.256 |
| 0.9215277777777778 | -0.256 |
| 0.9222222222222222 | -0.256 |
| 0.9229166666666666 | -0.256 |
| 0.9236111111111112 | -0.256 |
| 0.9243055555555556 | -0.256 |
| 0.9249999999999999 | -0.256 |
| 0.9256944444444444 | -0.256 |
| 0.9263888888888889 | -0.256 |
| 0.9270833333333334 | -0.256 |
| 0.9277777777777777 | -0.256 |
| 0.9284722222222223 | -0.256 |
| 0.9291666666666667 | -0.256 |
| 0.9298611111111111 | -0.256 |
| 0.9305555555555555 | -0.256 |
| 0.93125 | -0.256 |
| 0.9319444444444445 | -0.256 |
| 0.9326388888888889 | -0.256 |
| 0.9333333333333332 | -0.256 |
| 0.9340277777777778 | -0.256 |
| 0.9347222222222222 | -0.256 |
| 0.9354166666666667 | -0.256 |
| 0.936111111111111 | -0.256 |
| 0.9368055555555556 | -0.256 |
| 0.9375 | -0.256 |
| 0.9381944444444444 | -0.256 |
| 0.938888888888889 | -0.256 |
| 0.9395833333333333 | -0.256 |
| 0.9402777777777778 | -0.256 |
| 0.9409722222222222 | -0.256 |
| 0.9416666666666668 | -0.256 |
| 0.9423611111111111 | -0.256 |
| 0.9430555555555555 | -0.256 |
| 0.94375 | -0.256 |
| 0.9444444444444445 | -0.256 |
| 0.9451388888888889 | -0.256 |
| 0.9458333333333333 | -0.256 |
| 0.9465277777777777 | -0.256 |
| 0.9472222222222223 | -0.256 |
| 0.9479166666666666 | -0.256 |
| 0.9486111111111111 | -0.256 |
| 0.9493055555555556 | -0.256 |
| 0.9500000000000001 | -0.256 |
| 0.9506944444444444 | -0.256 |
| 0.9513888888888888 | -0.256 |
| 0.9520833333333334 | -0.256 |
| 0.9527777777777778 | -0.256 |
| 0.9534722222222222 | -0.256 |
| 0.9541666666666666 | -0.256 |
| 0.9548611111111112 | -0.256 |
| 0.9555555555555556 | -0.256 |
| 0.9562499999999999 | -0.256 |
| 0.9569444444444444 | -0.256 |
| 0.9576388888888889 | -0.256 |
| 0.9583333333333334 | -0.256 |
| 0.9590277777777777 | -0.256 |
| 0.9597222222222223 | -0.256 |
| 0.9604166666666667 | -0.256 |
| 0.9611111111111111 | -0.256 |
| 0.9618055555555555 | -0.256 |
| 0.9625 | -0.256 |
| 0.9631944444444445 | -0.256 |
| 0.9638888888888889 | -0.256 |
| 0.9645833333333332 | -0.256 |
| 0.9652777777777778 | -0.256 |
| 0.9659722222222222 | -0.256 |
| 0.9666666666666667 | -0.256 |
| 0.967361111111111 | -0.256 |
| 0.9680555555555556 | -0.256 |
| 0.96875 | -0.256 |
| 0.9694444444444444 | -0.256 |
| 0.970138888888889 | -0.256 |
| 0.9708333333333333 | -0.256 |
| 0.9715277777777778 | -0.256 |
| 0.9722222222222222 | -0.256 |
| 0.9729166666666668 | -0.256 |
| 0.9736111111111111 | -0.256 |
| 0.9743055555555555 | -0.256 |
| 0.975 | -0.256 |
| 0.9756944444444445 | -0.256 |
| 0.9763888888888889 | -0.256 |
| 0.9770833333333333 | -0.256 |
| 0.9777777777777777 | -0.256 |
| 0.9784722222222223 | -0.256 |
| 0.9791666666666666 | -0.256 |
| 0.9798611111111111 | -0.256 |
| 0.9805555555555556 | -0.256 |
| 0.9812500000000001 | -0.256 |
| 0.9819444444444444 | -0.256 |
| 0.9826388888888888 | -0.256 |
| 0.9833333333333334 | -0.256 |
| 0.9840277777777778 | -0.256 |
| 0.9847222222222222 | -0.256 |
| 0.9854166666666666 | -0.256 |
| 0.9861111111111112 | -0.256 |
| 0.9868055555555556 | -0.256 |
| 0.9874999999999999 | -0.256 |
| 0.9881944444444444 | -0.256 |
| 0.9888888888888889 | -0.256 |
| 0.9895833333333334 | -0.256 |
| 0.9902777777777777 | -0.256 |
| 0.9909722222222223 | -0.256 |
| 0.9916666666666667 | -0.256 |
| 0.9923611111111111 | -0.256 |
| 0.9930555555555555 | -0.256 |
| 0.99375 | -0.256 |
| 0.9944444444444445 | -0.256 |
| 0.9951388888888889 | -0.256 |
| 0.9958333333333332 | -0.256 |
| 0.9965277777777778 | -0.256 |
| 0.9972222222222222 | -0.256 |
| 0.9979166666666667 | -0.256 |
| 0.998611111111111 | -0.256 |
| 0.9993055555555556 | 0 |